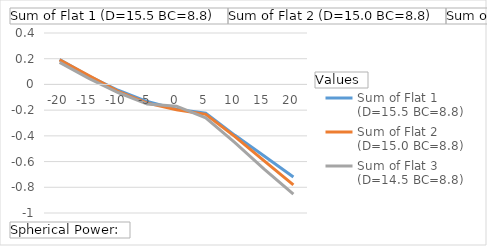
| Category | Sum of Flat 1 (D=15.5 BC=8.8) | Sum of Flat 2 (D=15.0 BC=8.8) | Sum of Flat 3 (D=14.5 BC=8.8) |
|---|---|---|---|
| -20 | 0.193 | 0.191 | 0.172 |
| -15 | 0.066 | 0.068 | 0.048 |
| -10 | -0.045 | -0.054 | -0.063 |
| -5 | -0.133 | -0.146 | -0.153 |
| 0 | -0.192 | -0.196 | -0.169 |
| 5 | -0.224 | -0.232 | -0.26 |
| 10 | -0.396 | -0.406 | -0.452 |
| 15 | -0.557 | -0.595 | -0.659 |
| 20 | -0.72 | -0.782 | -0.854 |